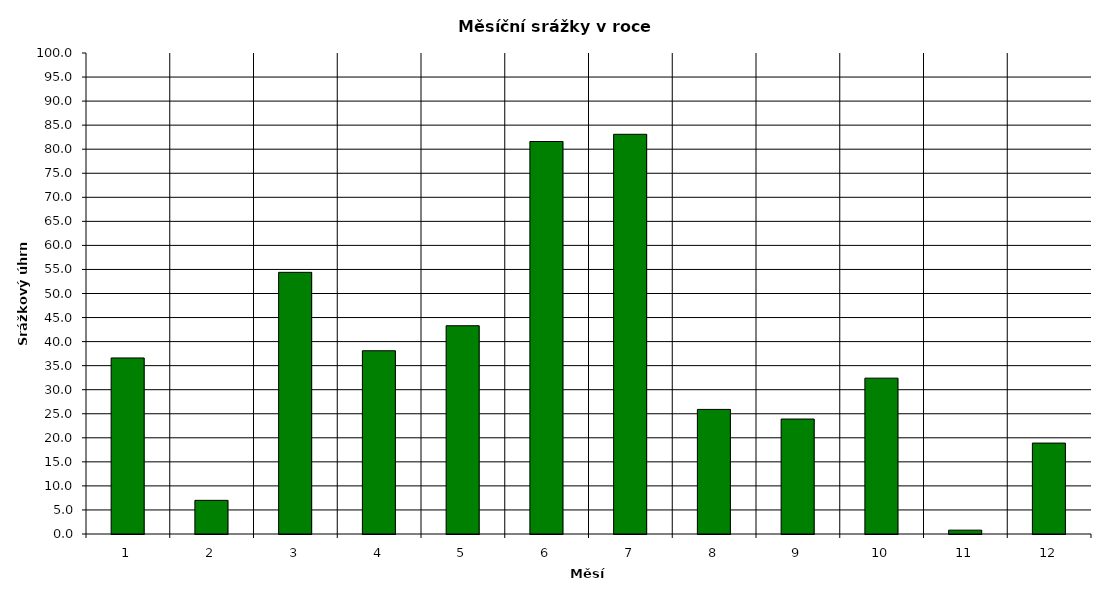
| Category | Series 0 |
|---|---|
| 0 | 36.6 |
| 1 | 7 |
| 2 | 54.4 |
| 3 | 38.1 |
| 4 | 43.3 |
| 5 | 81.6 |
| 6 | 83.1 |
| 7 | 25.9 |
| 8 | 23.9 |
| 9 | 32.4 |
| 10 | 0.8 |
| 11 | 18.9 |